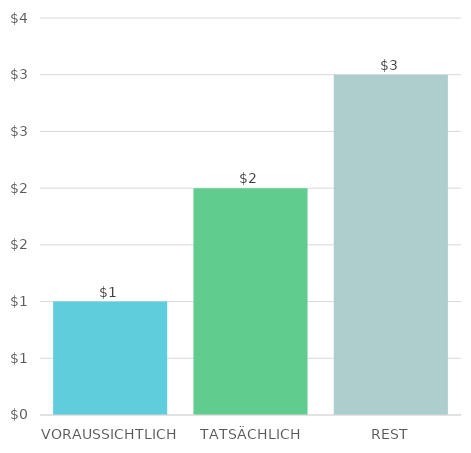
| Category | Series 0 |
|---|---|
| VORAUSSICHTLICH | 1 |
| TATSÄCHLICH | 2 |
| REST | 3 |